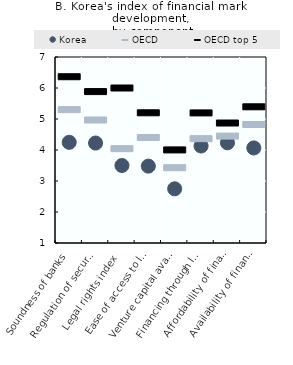
| Category | Korea | OECD | OECD top 5 |
|---|---|---|---|
| Soundness of banks | 4.248 | 5.302 | 6.364 |
| Regulation of securities exchanges | 4.224 | 4.967 | 5.884 |
| Legal rights index | 3.5 | 4.043 | 6 |
| Ease of access to loans | 3.48 | 4.403 | 5.201 |
| Venture capital availability | 2.748 | 3.429 | 4.003 |
| Financing through local equity market | 4.13 | 4.366 | 5.196 |
| Affordability of financial services | 4.233 | 4.449 | 4.87 |
| Availability of financial services | 4.066 | 4.823 | 5.393 |